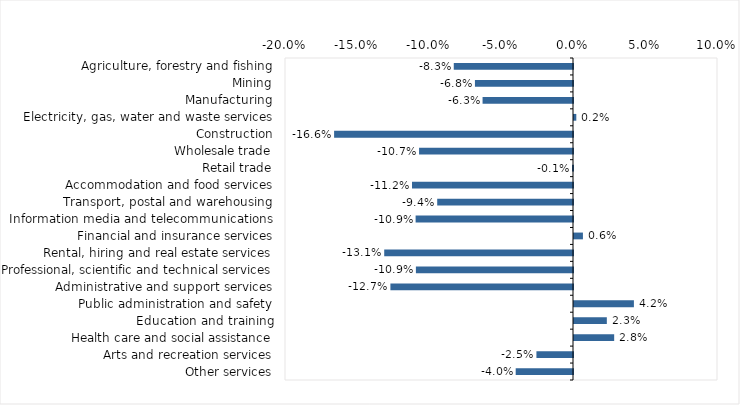
| Category | This week |
|---|---|
| Agriculture, forestry and fishing | -0.083 |
| Mining | -0.068 |
| Manufacturing | -0.063 |
| Electricity, gas, water and waste services | 0.002 |
| Construction | -0.166 |
| Wholesale trade | -0.107 |
| Retail trade | -0.001 |
| Accommodation and food services | -0.112 |
| Transport, postal and warehousing | -0.094 |
| Information media and telecommunications | -0.109 |
| Financial and insurance services | 0.006 |
| Rental, hiring and real estate services | -0.131 |
| Professional, scientific and technical services | -0.109 |
| Administrative and support services | -0.127 |
| Public administration and safety | 0.042 |
| Education and training | 0.023 |
| Health care and social assistance | 0.028 |
| Arts and recreation services | -0.025 |
| Other services | -0.04 |